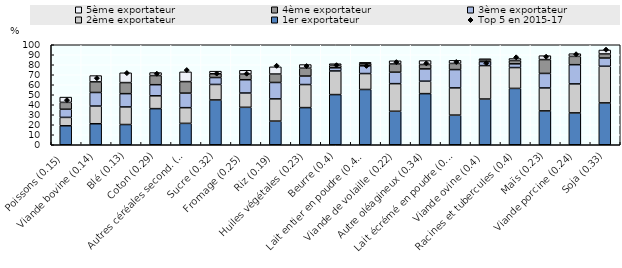
| Category | 1er exportateur | 2ème exportateur | 3ème exportateur | 4ème exportateur | 5ème exportateur |
|---|---|---|---|---|---|
| Poissons (0.15) | 18.957 | 8.418 | 8.136 | 6.881 | 5.258 |
| Viande bovine (0.14) | 21.005 | 17.692 | 13.578 | 10.612 | 6.284 |
| Blé (0.13) | 20.228 | 17.587 | 13.285 | 11.061 | 9.8 |
| Coton (0.29) | 36.12 | 12.818 | 11.118 | 9.159 | 2.965 |
| Autres céréales second. (0.14) | 21.377 | 15.716 | 14.533 | 11.543 | 9.733 |
| Sucre (0.32) | 44.797 | 15.505 | 6.907 | 3.763 | 2.616 |
| Fromage (0.25) | 37.445 | 14.301 | 13.276 | 5.617 | 3.835 |
| Riz (0.19) | 23.644 | 22.232 | 16.395 | 8.446 | 7.191 |
| Huiles végétales (0.23) | 37.151 | 23.06 | 8.477 | 7.896 | 3.61 |
| Beurre (0.4) | 50.167 | 23.633 | 3.145 | 2.568 | 1.523 |
| Lait entier en poudre (0.45) | 55.27 | 15.929 | 7.738 | 1.988 | 1.505 |
| Viande de volaille (0.22) | 33.495 | 27.6 | 11.463 | 8.24 | 3.175 |
| Autre oléagineux (0.34) | 51.114 | 12.461 | 12.296 | 4.373 | 3.94 |
| Lait écrémé en poudre (0.23) | 29.643 | 27.216 | 18.302 | 6.189 | 3.063 |
| Viande ovine (0.4) | 45.719 | 33.425 | 4.011 | 1.523 | 1.351 |
| Racines et tubercules (0.4) | 56.348 | 20.849 | 3.731 | 3.297 | 2.013 |
| Maïs (0.23) | 33.867 | 22.96 | 14.514 | 13.841 | 3.908 |
| Viande porcine (0.24) | 31.852 | 29.02 | 19.198 | 8.331 | 2.673 |
| Soja (0.33) | 41.845 | 36.641 | 8.219 | 4.081 | 3.954 |